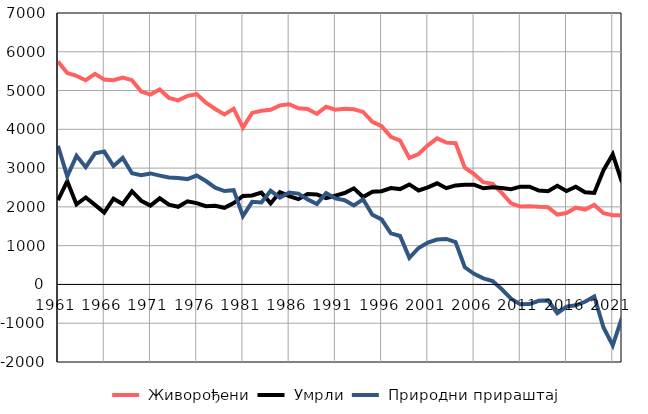
| Category |  Живорођени |  Умрли |  Природни прираштај |
|---|---|---|---|
| 1961.0 | 5747 | 2172 | 3575 |
| 1962.0 | 5454 | 2664 | 2790 |
| 1963.0 | 5380 | 2064 | 3316 |
| 1964.0 | 5267 | 2243 | 3024 |
| 1965.0 | 5432 | 2052 | 3380 |
| 1966.0 | 5282 | 1855 | 3427 |
| 1967.0 | 5266 | 2211 | 3055 |
| 1968.0 | 5337 | 2074 | 3263 |
| 1969.0 | 5268 | 2402 | 2866 |
| 1970.0 | 4974 | 2158 | 2816 |
| 1971.0 | 4896 | 2033 | 2863 |
| 1972.0 | 5028 | 2221 | 2807 |
| 1973.0 | 4812 | 2056 | 2756 |
| 1974.0 | 4748 | 2002 | 2746 |
| 1975.0 | 4862 | 2145 | 2717 |
| 1976.0 | 4906 | 2097 | 2809 |
| 1977.0 | 4685 | 2018 | 2667 |
| 1978.0 | 4524 | 2028 | 2496 |
| 1979.0 | 4385 | 1977 | 2408 |
| 1980.0 | 4531 | 2100 | 2431 |
| 1981.0 | 4043 | 2281 | 1762 |
| 1982.0 | 4424 | 2293 | 2131 |
| 1983.0 | 4481 | 2368 | 2113 |
| 1984.0 | 4503 | 2090 | 2413 |
| 1985.0 | 4619 | 2382 | 2237 |
| 1986.0 | 4646 | 2276 | 2370 |
| 1987.0 | 4542 | 2200 | 2342 |
| 1988.0 | 4526 | 2333 | 2193 |
| 1989.0 | 4398 | 2322 | 2076 |
| 1990.0 | 4583 | 2224 | 2359 |
| 1991.0 | 4508 | 2291 | 2217 |
| 1992.0 | 4530 | 2358 | 2172 |
| 1993.0 | 4517 | 2479 | 2038 |
| 1994.0 | 4449 | 2256 | 2193 |
| 1995.0 | 4191 | 2393 | 1798 |
| 1996.0 | 4083 | 2405 | 1678 |
| 1997.0 | 3806 | 2487 | 1319 |
| 1998.0 | 3708 | 2459 | 1249 |
| 1999.0 | 3265 | 2579 | 686 |
| 2000.0 | 3364 | 2424 | 940 |
| 2001.0 | 3588 | 2506 | 1082 |
| 2002.0 | 3767 | 2608 | 1159 |
| 2003.0 | 3657 | 2483 | 1174 |
| 2004.0 | 3644 | 2553 | 1091 |
| 2005.0 | 3013 | 2571 | 442 |
| 2006.0 | 2844 | 2571 | 273 |
| 2007.0 | 2637 | 2480 | 157 |
| 2008.0 | 2593 | 2507 | 86 |
| 2009.0 | 2361 | 2486 | -125 |
| 2010.0 | 2091 | 2456 | -365 |
| 2011.0 | 2008 | 2521 | -513 |
| 2012.0 | 2015 | 2521 | -506 |
| 2013.0 | 2001 | 2422 | -421 |
| 2014.0 | 1993 | 2404 | -411 |
| 2015.0 | 1803 | 2544 | -741 |
| 2016.0 | 1840 | 2410 | -570 |
| 2017.0 | 1980 | 2518 | -538 |
| 2018.0 | 1931 | 2378 | -447 |
| 2019.0 | 2050 | 2361 | -311 |
| 2020.0 | 1837 | 2948 | -1111 |
| 2021.0 | 1784 | 3355 | -1571 |
| 2022.0 | 1781 | 2635 | -854 |